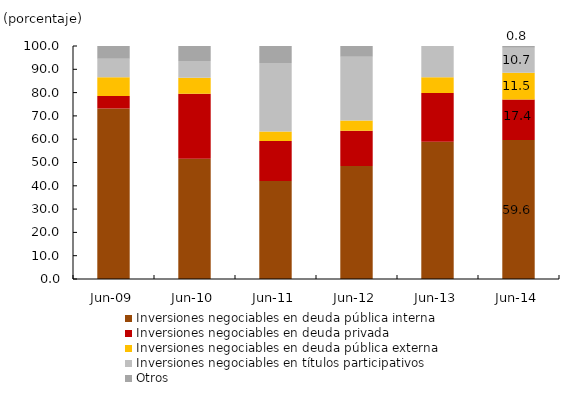
| Category | Inversiones negociables en deuda pública interna | Inversiones negociables en deuda privada | Inversiones negociables en deuda pública externa | Inversiones negociables en títulos participativos | Otros |
|---|---|---|---|---|---|
| 2009-06-01 | 73.151 | 5.366 | 8.075 | 7.941 | 5.468 |
| 2010-06-01 | 51.59 | 27.882 | 6.951 | 7.153 | 6.423 |
| 2011-06-01 | 42.054 | 17.138 | 4.134 | 29.343 | 7.331 |
| 2012-06-01 | 48.531 | 15.048 | 4.464 | 27.373 | 4.583 |
| 2013-06-01 | 58.901 | 20.979 | 6.735 | 16.729 | -3.344 |
| 2014-06-01 | 59.614 | 17.384 | 11.507 | 10.728 | 0.767 |